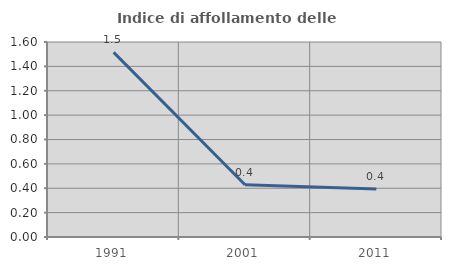
| Category | Indice di affollamento delle abitazioni  |
|---|---|
| 1991.0 | 1.515 |
| 2001.0 | 0.429 |
| 2011.0 | 0.394 |